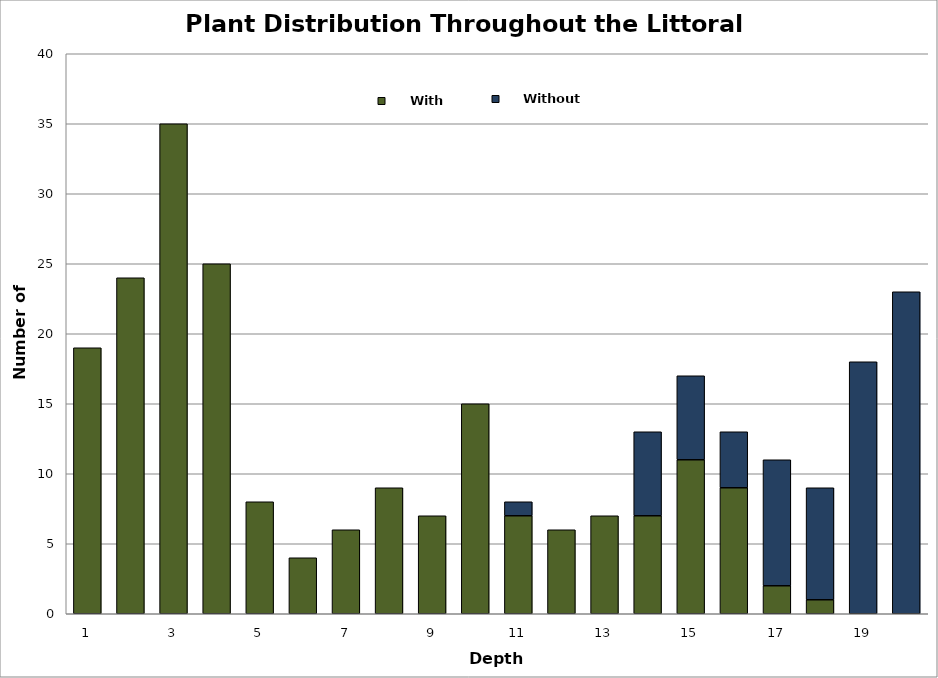
| Category | With Plants | Without Plants |
|---|---|---|
| 0 | 19 | 0 |
| 1 | 24 | 0 |
| 2 | 35 | 0 |
| 3 | 25 | 0 |
| 4 | 8 | 0 |
| 5 | 4 | 0 |
| 6 | 6 | 0 |
| 7 | 9 | 0 |
| 8 | 7 | 0 |
| 9 | 15 | 0 |
| 10 | 7 | 1 |
| 11 | 6 | 0 |
| 12 | 7 | 0 |
| 13 | 7 | 6 |
| 14 | 11 | 6 |
| 15 | 9 | 4 |
| 16 | 2 | 9 |
| 17 | 1 | 8 |
| 18 | 0 | 18 |
| 19 | 0 | 23 |